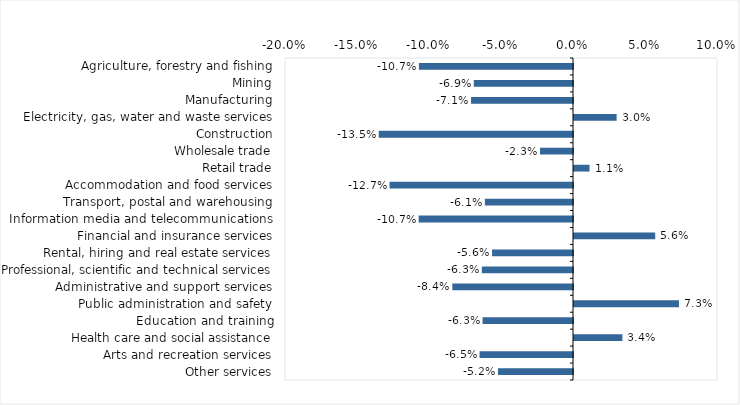
| Category | This week |
|---|---|
| Agriculture, forestry and fishing | -0.107 |
| Mining | -0.069 |
| Manufacturing | -0.071 |
| Electricity, gas, water and waste services | 0.03 |
| Construction | -0.135 |
| Wholesale trade | -0.023 |
| Retail trade | 0.011 |
| Accommodation and food services | -0.127 |
| Transport, postal and warehousing | -0.061 |
| Information media and telecommunications | -0.107 |
| Financial and insurance services | 0.056 |
| Rental, hiring and real estate services | -0.056 |
| Professional, scientific and technical services | -0.063 |
| Administrative and support services | -0.084 |
| Public administration and safety | 0.073 |
| Education and training | -0.063 |
| Health care and social assistance | 0.034 |
| Arts and recreation services | -0.065 |
| Other services | -0.052 |